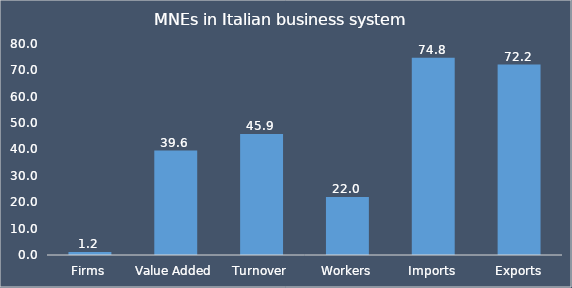
| Category | Series 0 |
|---|---|
| Firms | 1.181 |
| Value Added | 39.607 |
| Turnover | 45.91 |
| Workers | 22.007 |
| Imports | 74.755 |
| Exports | 72.182 |